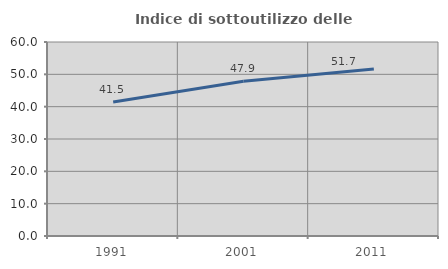
| Category | Indice di sottoutilizzo delle abitazioni  |
|---|---|
| 1991.0 | 41.476 |
| 2001.0 | 47.877 |
| 2011.0 | 51.651 |